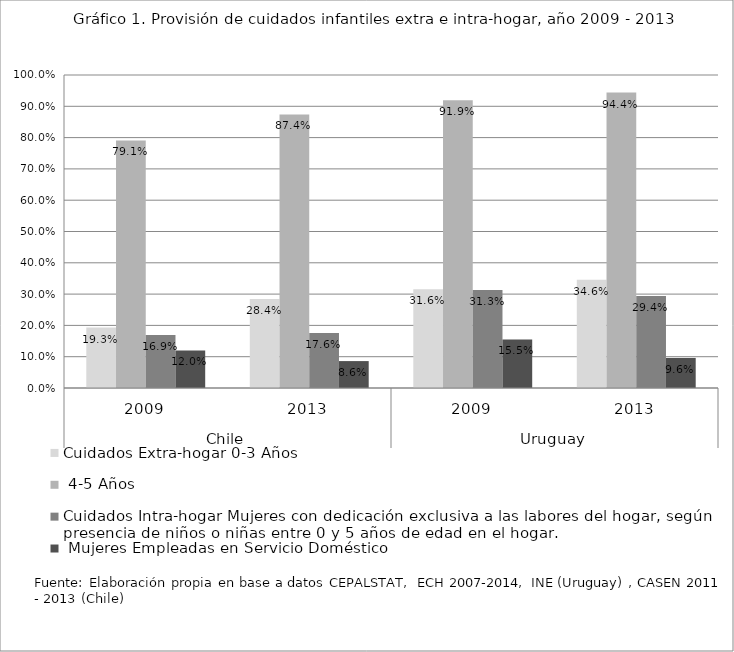
| Category | Cuidados Extra-hogar 0-3 Años | Cuidados Extra-hogar 4-5 Años | Cuidados Intra-hogar Mujeres con dedicación exclusiva a las labores del hogar, según presencia de niños o niñas entre 0 y 5 años de edad en el hogar. | Cuidados Intra-hogar Mujeres Empleadas en Servicio Doméstico |
|---|---|---|---|---|
| 0 | 0.193 | 0.791 | 0.169 | 0.12 |
| 1 | 0.284 | 0.874 | 0.176 | 0.086 |
| 2 | 0.316 | 0.919 | 0.313 | 0.155 |
| 3 | 0.346 | 0.944 | 0.294 | 0.096 |